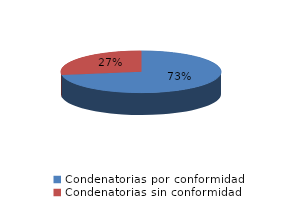
| Category | Series 0 |
|---|---|
| 0 | 61 |
| 1 | 23 |